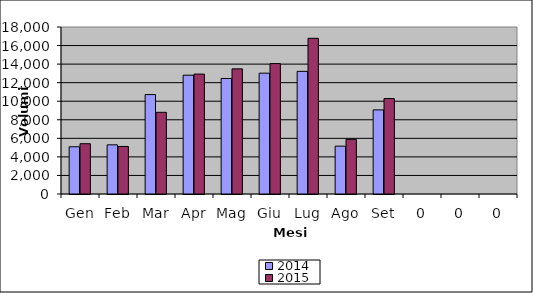
| Category | 2014 | 2015 |
|---|---|---|
| Gen | 5090 | 5421 |
| Feb | 5299 | 5126 |
| Mar | 10717 | 8805 |
| Apr | 12805 | 12923 |
| Mag | 12450 | 13488 |
| Giu | 13022 | 14055 |
| Lug | 13218 | 16781 |
| Ago | 5156 | 5893 |
| Set | 9064 | 10289 |
| 0 | 0 | 0 |
| 0 | 0 | 0 |
| 0 | 0 | 0 |